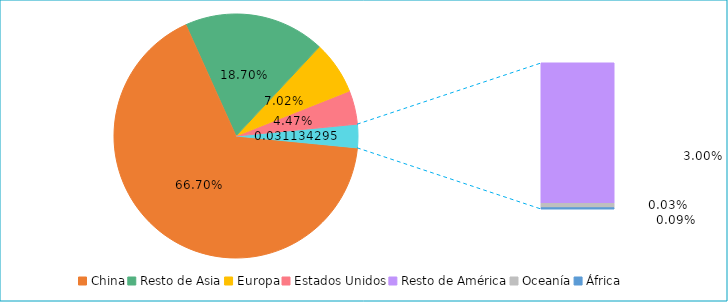
| Category | Series 0 |
|---|---|
| China | 0.667 |
| Resto de Asia | 0.187 |
| Europa | 0.07 |
| Estados Unidos | 0.045 |
| Resto de América | 0.03 |
| Oceanía | 0.001 |
| África | 0 |